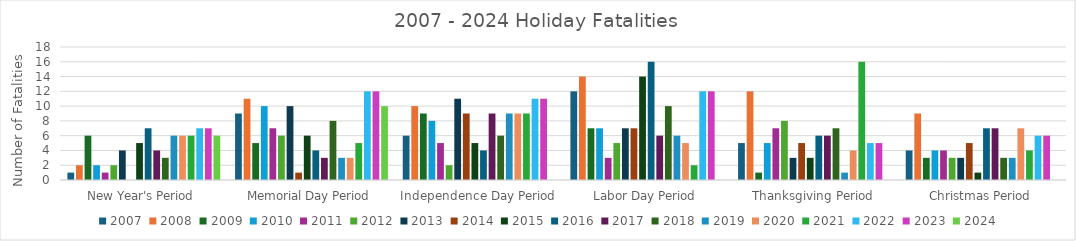
| Category | 2007 | 2008 | 2009 | 2010 | 2011 | 2012 | 2013 | 2014 | 2015 | 2016 | 2017 | 2018 | 2019 | 2020 | 2021 | 2022 | 2023 | 2024 |
|---|---|---|---|---|---|---|---|---|---|---|---|---|---|---|---|---|---|---|
| New Year's Period | 1 | 2 | 6 | 2 | 1 | 2 | 4 | 0 | 5 | 7 | 4 | 3 | 6 | 6 | 6 | 7 | 7 | 6 |
| Memorial Day Period | 9 | 11 | 5 | 10 | 7 | 6 | 10 | 1 | 6 | 4 | 3 | 8 | 3 | 3 | 5 | 12 | 12 | 10 |
| Independence Day Period | 6 | 10 | 9 | 8 | 5 | 2 | 11 | 9 | 5 | 4 | 9 | 6 | 9 | 9 | 9 | 11 | 11 | 0 |
| Labor Day Period | 12 | 14 | 7 | 7 | 3 | 5 | 7 | 7 | 14 | 16 | 6 | 10 | 6 | 5 | 2 | 12 | 12 | 0 |
| Thanksgiving Period | 5 | 12 | 1 | 5 | 7 | 8 | 3 | 5 | 3 | 6 | 6 | 7 | 1 | 4 | 16 | 5 | 5 | 0 |
| Christmas Period | 4 | 9 | 3 | 4 | 4 | 3 | 3 | 5 | 1 | 7 | 7 | 3 | 3 | 7 | 4 | 6 | 6 | 0 |